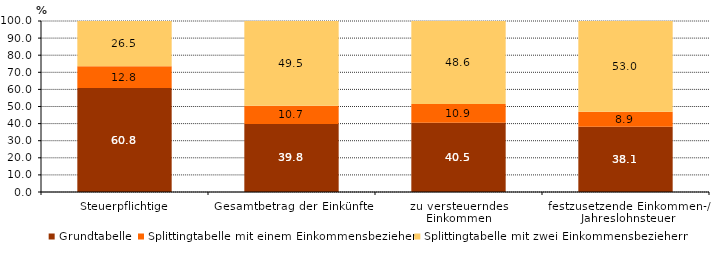
| Category | Grundtabelle | Splittingtabelle mit einem Einkommensbezieher | Splittingtabelle mit zwei Einkommensbeziehern |
|---|---|---|---|
| Steuerpflichtige | 60.8 | 12.8 | 26.5 |
| Gesamtbetrag der Einkünfte | 39.8 | 10.7 | 49.5 |
| zu versteuerndes 
Einkommen | 40.5 | 10.9 | 48.6 |
| festzusetzende Einkommen-/ Jahreslohnsteuer | 38.1 | 8.9 | 53 |